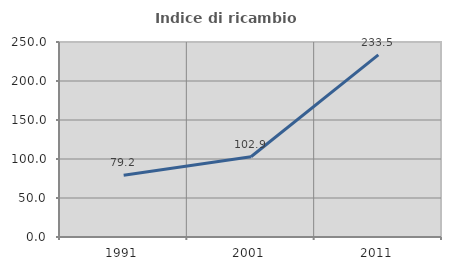
| Category | Indice di ricambio occupazionale  |
|---|---|
| 1991.0 | 79.195 |
| 2001.0 | 102.883 |
| 2011.0 | 233.474 |